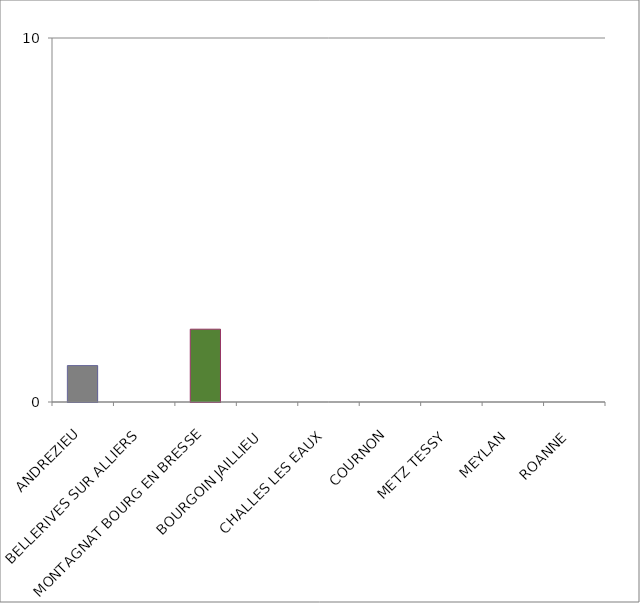
| Category | Series 0 |
|---|---|
| ANDREZIEU | 1 |
| BELLERIVES SUR ALLIERS  | 0 |
| MONTAGNAT BOURG EN BRESSE | 2 |
| BOURGOIN JAILLIEU  | 0 |
| CHALLES LES EAUX  | 0 |
| COURNON | 0 |
| METZ TESSY  | 0 |
| MEYLAN  | 0 |
| ROANNE  | 0 |